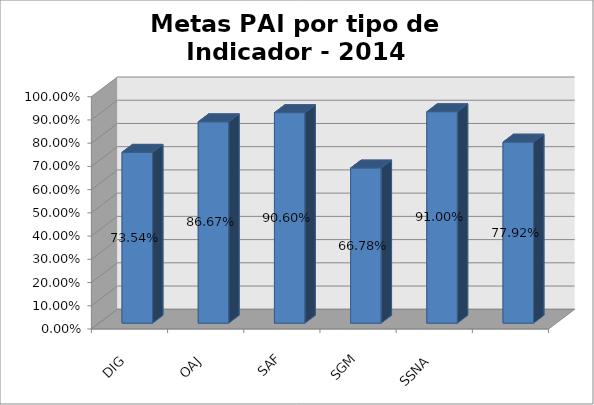
| Category | PROMEDIO  |
|---|---|
| DIG | 0.735 |
| OAJ | 0.867 |
| SAF | 0.906 |
| SGM | 0.668 |
| SSNA | 0.91 |